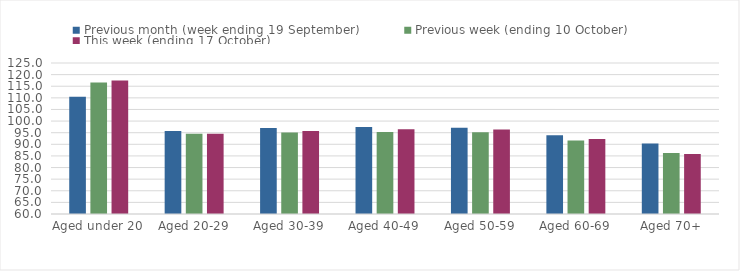
| Category | Previous month (week ending 19 September) | Previous week (ending 10 October) | This week (ending 17 October) |
|---|---|---|---|
| Aged under 20 | 110.48 | 116.64 | 117.42 |
| Aged 20-29 | 95.71 | 94.54 | 94.53 |
| Aged 30-39 | 97.06 | 95.04 | 95.76 |
| Aged 40-49 | 97.43 | 95.29 | 96.48 |
| Aged 50-59 | 97.15 | 95.14 | 96.34 |
| Aged 60-69 | 93.91 | 91.61 | 92.3 |
| Aged 70+ | 90.4 | 86.22 | 85.83 |